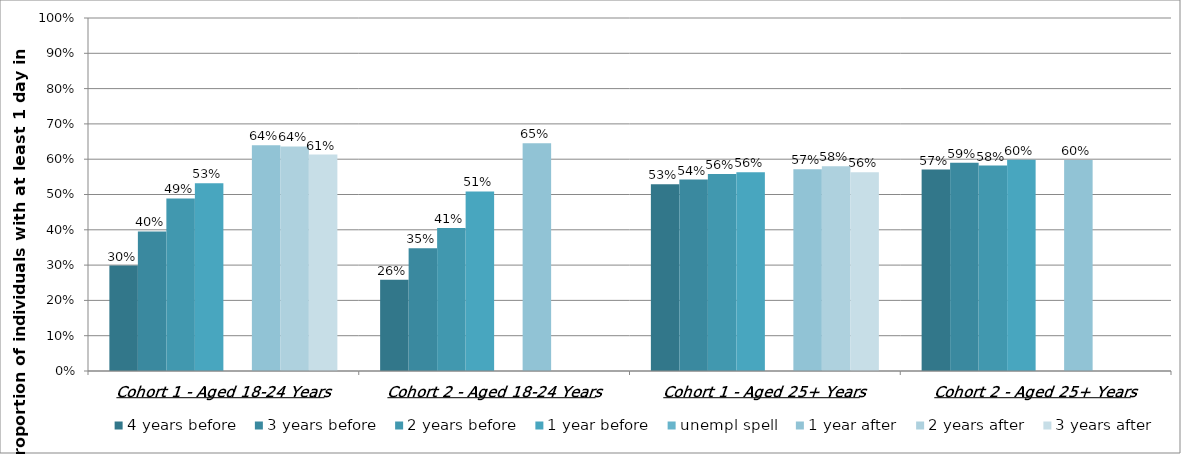
| Category | 4 years before | 3 years before | 2 years before | 1 year before | unempl spell | 1 year after | 2 years after | 3 years after |
|---|---|---|---|---|---|---|---|---|
| Cohort 1 - Aged 18-24 Years | 0.299 | 0.396 | 0.489 | 0.532 | 0 | 0.64 | 0.636 | 0.613 |
| Cohort 2 - Aged 18-24 Years | 0.259 | 0.348 | 0.405 | 0.509 | 0 | 0.645 | 0 | 0 |
| Cohort 1 - Aged 25+ Years | 0.529 | 0.542 | 0.558 | 0.563 | 0 | 0.571 | 0.58 | 0.563 |
| Cohort 2 - Aged 25+ Years | 0.57 | 0.59 | 0.582 | 0.598 | 0 | 0.598 | 0 | 0 |